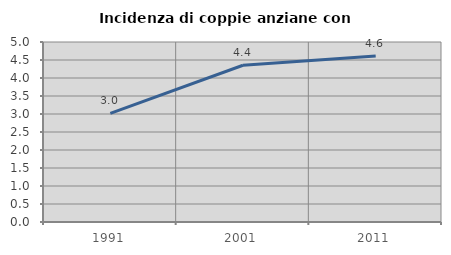
| Category | Incidenza di coppie anziane con figli |
|---|---|
| 1991.0 | 3.02 |
| 2001.0 | 4.355 |
| 2011.0 | 4.609 |